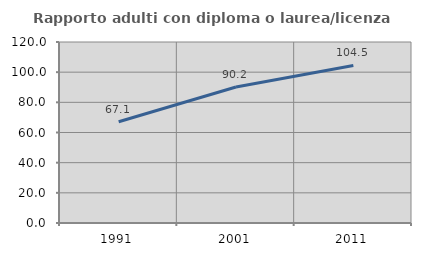
| Category | Rapporto adulti con diploma o laurea/licenza media  |
|---|---|
| 1991.0 | 67.109 |
| 2001.0 | 90.196 |
| 2011.0 | 104.473 |